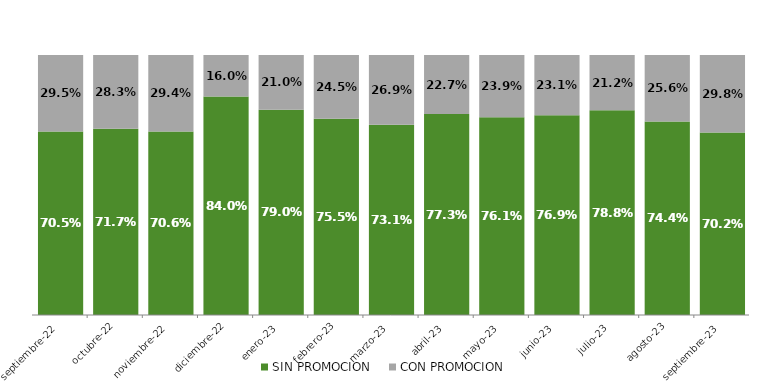
| Category | SIN PROMOCION   | CON PROMOCION   |
|---|---|---|
| 2022-09-01 | 0.705 | 0.295 |
| 2022-10-01 | 0.717 | 0.283 |
| 2022-11-01 | 0.706 | 0.294 |
| 2022-12-01 | 0.84 | 0.16 |
| 2023-01-01 | 0.79 | 0.21 |
| 2023-02-01 | 0.755 | 0.245 |
| 2023-03-01 | 0.731 | 0.269 |
| 2023-04-01 | 0.773 | 0.227 |
| 2023-05-01 | 0.761 | 0.239 |
| 2023-06-01 | 0.769 | 0.231 |
| 2023-07-01 | 0.788 | 0.212 |
| 2023-08-01 | 0.744 | 0.256 |
| 2023-09-01 | 0.702 | 0.298 |